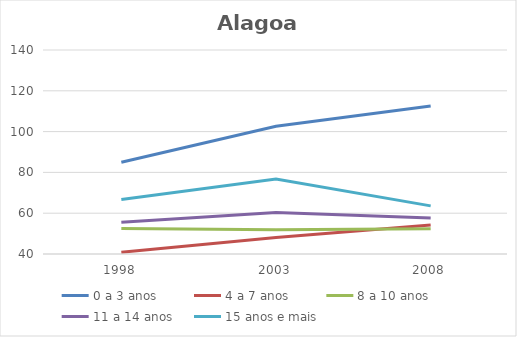
| Category | 0 a 3 anos | 4 a 7 anos | 8 a 10 anos | 11 a 14 anos | 15 anos e mais |
|---|---|---|---|---|---|
| 1998.0 | 85 | 40.8 | 52.5 | 55.6 | 66.7 |
| 2003.0 | 102.6 | 48.1 | 51.9 | 60.4 | 76.8 |
| 2008.0 | 112.5 | 54.2 | 52.4 | 57.6 | 63.6 |